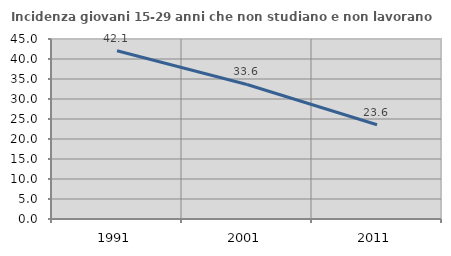
| Category | Incidenza giovani 15-29 anni che non studiano e non lavorano  |
|---|---|
| 1991.0 | 42.065 |
| 2001.0 | 33.628 |
| 2011.0 | 23.556 |